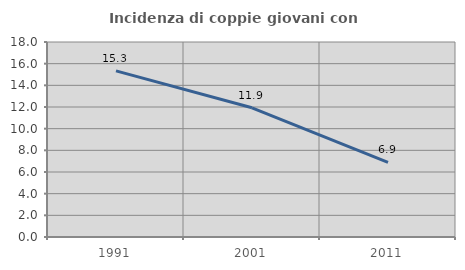
| Category | Incidenza di coppie giovani con figli |
|---|---|
| 1991.0 | 15.333 |
| 2001.0 | 11.925 |
| 2011.0 | 6.884 |